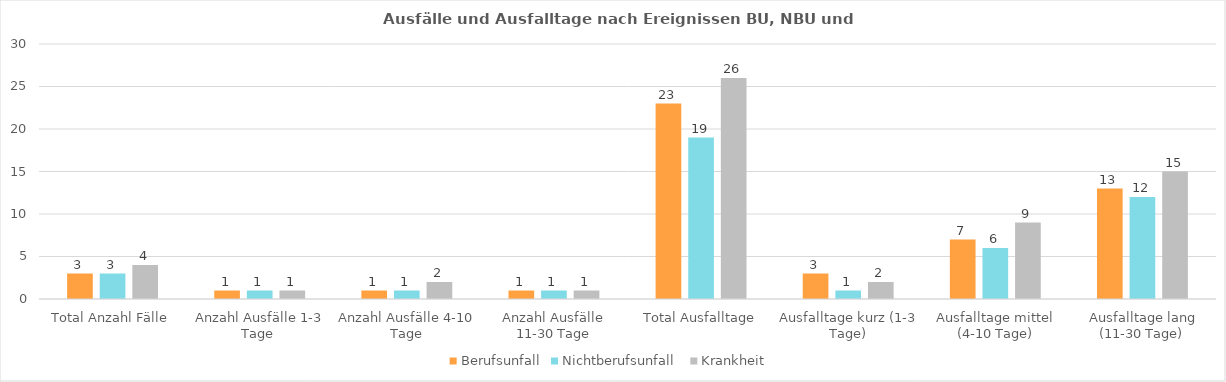
| Category | Berufsunfall | Nichtberufsunfall  | Krankheit  |
|---|---|---|---|
| Total Anzahl Fälle | 3 | 3 | 4 |
| Anzahl Ausfälle 1-3 Tage  | 1 | 1 | 1 |
| Anzahl Ausfälle 4-10 Tage | 1 | 1 | 2 |
| Anzahl Ausfälle 11-30 Tage | 1 | 1 | 1 |
| Total Ausfalltage | 23 | 19 | 26 |
| Ausfalltage kurz (1-3 Tage) | 3 | 1 | 2 |
| Ausfalltage mittel (4-10 Tage) | 7 | 6 | 9 |
| Ausfalltage lang (11-30 Tage) | 13 | 12 | 15 |